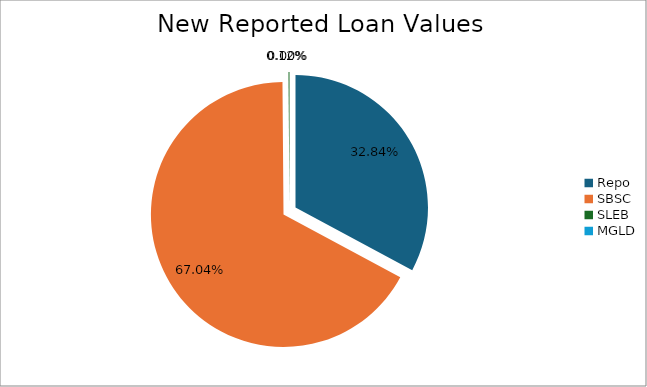
| Category | Series 0 |
|---|---|
| Repo | 14113.905 |
| SBSC | 28813.001 |
| SLEB | 53.164 |
| MGLD | 0 |